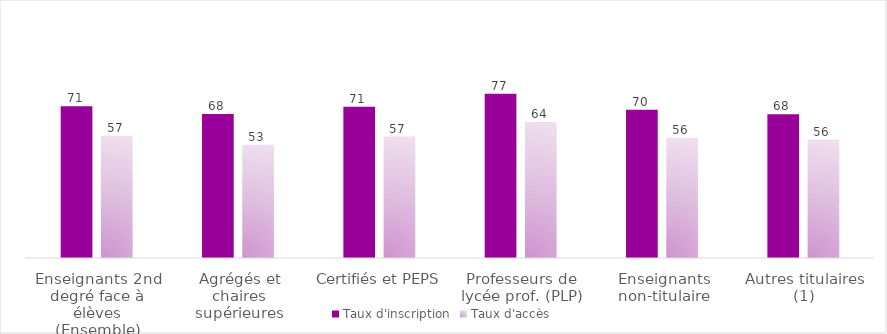
| Category | Taux d'inscription | Taux d'accès |
|---|---|---|
| Enseignants 2nd degré face à élèves (Ensemble) | 71.2 | 57.4 |
| Agrégés et chaires supérieures | 67.6 | 53.2 |
| Certifiés et PEPS | 71 | 57 |
| Professeurs de lycée prof. (PLP) | 77.1 | 63.9 |
| Enseignants non-titulaire | 69.6 | 56.4 |
| Autres titulaires (1) | 67.5 | 55.6 |